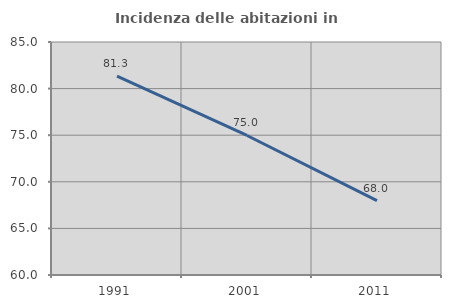
| Category | Incidenza delle abitazioni in proprietà  |
|---|---|
| 1991.0 | 81.341 |
| 2001.0 | 74.971 |
| 2011.0 | 67.972 |